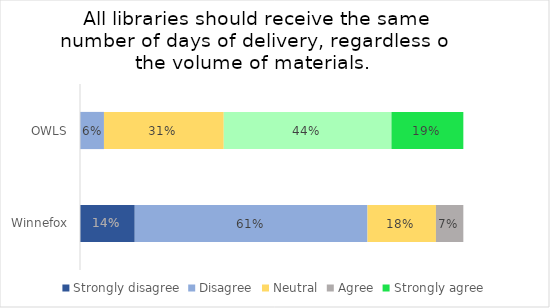
| Category | Strongly disagree | Disagree | Neutral | Agree | Strongly agree |
|---|---|---|---|---|---|
| OWLS | 0 | 0.062 | 0.312 | 0.438 | 0.188 |
| Winnefox | 0.143 | 0.607 | 0.179 | 0.071 | 0 |